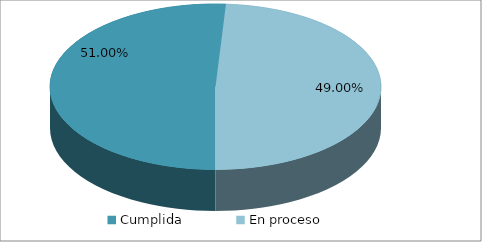
| Category | Series 0 |
|---|---|
| Cumplida | 0.51 |
| En proceso | 0.49 |